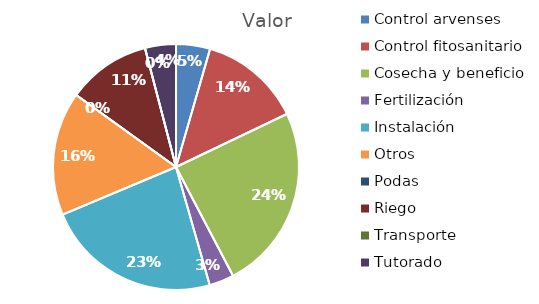
| Category | Valor |
|---|---|
| Control arvenses | 550000 |
| Control fitosanitario | 1650000 |
| Cosecha y beneficio | 3000600 |
| Fertilización | 400000 |
| Instalación | 2839286 |
| Otros | 2000000 |
| Podas | 0 |
| Riego | 1350000 |
| Transporte | 0 |
| Tutorado | 500000 |